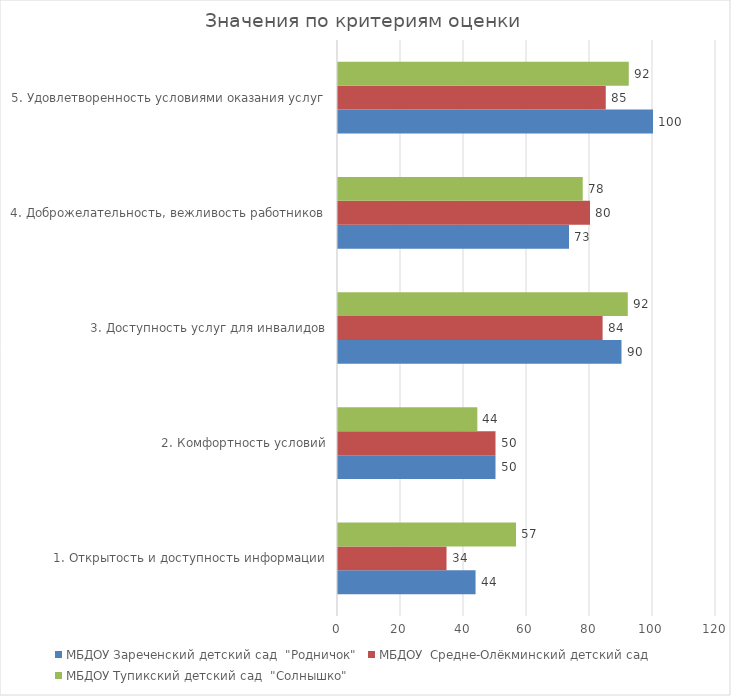
| Category | МБДОУ Зареченский детский сад  "Родничок" | МБДОУ  Средне-Олёкминский детский сад  | МБДОУ Тупикский детский сад  "Солнышко" |
|---|---|---|---|
| 1. Открытость и доступность информации | 43.669 | 34.455 | 56.51 |
| 2. Комфортность условий | 50 | 50 | 44.231 |
| 3. Доступность услуг для инвалидов | 90 | 84 | 92 |
| 4. Доброжелательность, вежливость работников | 73.333 | 80 | 77.692 |
| 5. Удовлетворенность условиями оказания услуг | 100 | 85 | 92.308 |